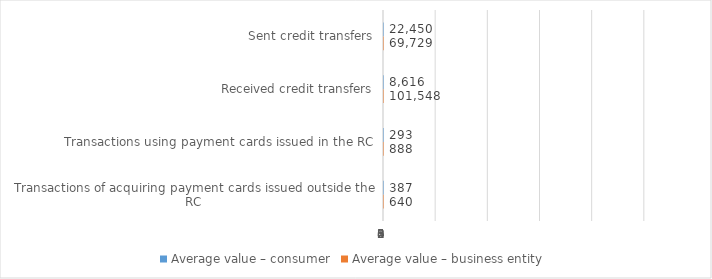
| Category | Average value – consumer | Average value – business entity  |
|---|---|---|
| Sent credit transfers | 22450.071 | 69728.695 |
| Received credit transfers | 8615.614 | 101547.753 |
| Transactions using payment cards issued in the RC | 292.533 | 888.073 |
| Transactions of acquiring payment cards issued outside the RC | 386.972 | 639.816 |